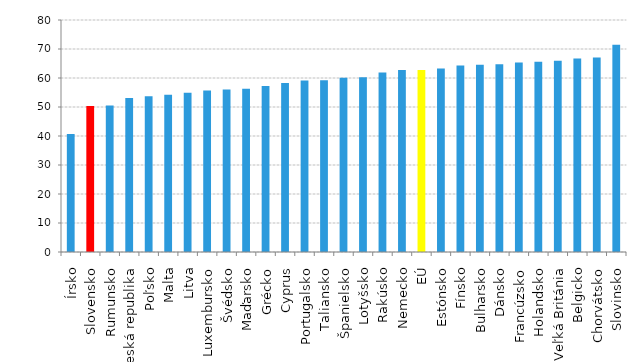
| Category | Series 0 |
|---|---|
| Írsko | 40.664 |
| Slovensko | 50.38 |
| Rumunsko | 50.547 |
| Česká republika | 53.122 |
| Poľsko | 53.688 |
| Malta | 54.242 |
| Litva | 54.891 |
| Luxembursko | 55.703 |
| Švédsko | 56.077 |
| Maďarsko | 56.312 |
| Grécko | 57.244 |
| Cyprus | 58.276 |
| Portugalsko | 59.131 |
| Taliansko | 59.189 |
| Španielsko | 60.056 |
| Lotyšsko | 60.218 |
| Rakúsko | 61.908 |
| Nemecko | 62.731 |
| EÚ | 62.735 |
| Estónsko | 63.291 |
| Fínsko | 64.349 |
| Bulharsko | 64.561 |
| Dánsko | 64.703 |
| Francúzsko | 65.321 |
| Holandsko | 65.561 |
| Veľká Británia | 65.923 |
| Belgicko | 66.761 |
| Chorvátsko | 67.046 |
| Slovinsko | 71.507 |